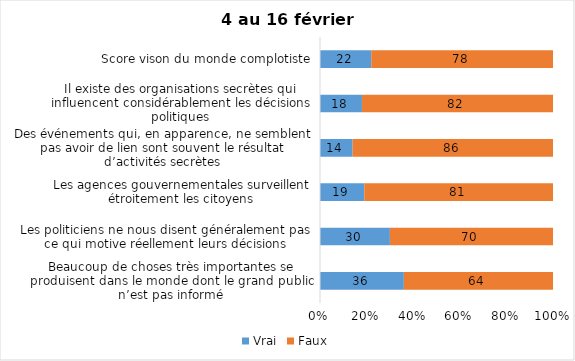
| Category | Vrai | Faux |
|---|---|---|
| Beaucoup de choses très importantes se produisent dans le monde dont le grand public n’est pas informé | 36 | 64 |
| Les politiciens ne nous disent généralement pas ce qui motive réellement leurs décisions | 30 | 70 |
| Les agences gouvernementales surveillent étroitement les citoyens | 19 | 81 |
| Des événements qui, en apparence, ne semblent pas avoir de lien sont souvent le résultat d’activités secrètes | 14 | 86 |
| Il existe des organisations secrètes qui influencent considérablement les décisions politiques | 18 | 82 |
| Score vison du monde complotiste | 22 | 78 |